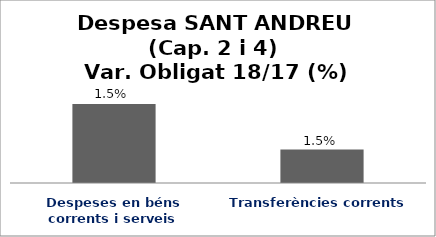
| Category | Series 0 |
|---|---|
| Despeses en béns corrents i serveis | 0.015 |
| Transferències corrents | 0.015 |